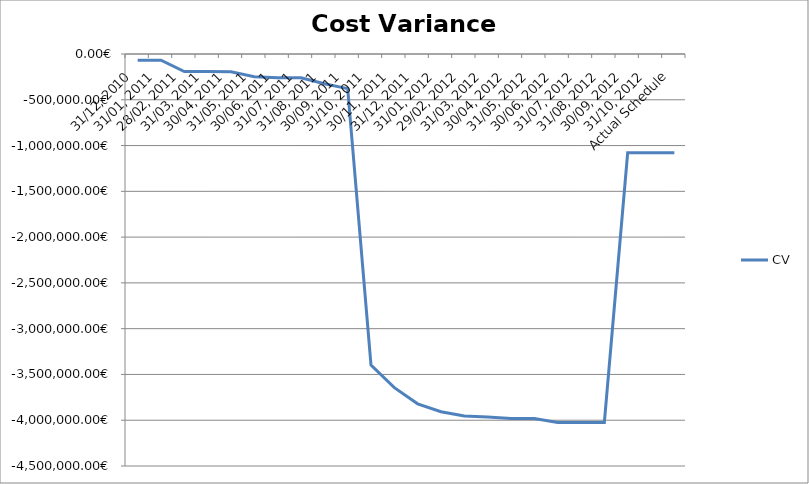
| Category | CV |
|---|---|
| 31/12, 2010 | -67983.03 |
| 31/01, 2011 | -67983.03 |
| 28/02, 2011 | -192248.889 |
| 31/03, 2011 | -192248.889 |
| 30/04, 2011 | -195073.429 |
| 31/05, 2011 | -247301.82 |
| 30/06, 2011 | -259171.91 |
| 31/07, 2011 | -259171.91 |
| 31/08, 2011 | -324457.33 |
| 30/09, 2011 | -378517.689 |
| 31/10, 2011 | -3396880.659 |
| 30/11, 2011 | -3644709.773 |
| 31/12, 2011 | -3821030.91 |
| 31/01, 2012 | -3907450.38 |
| 29/02, 2012 | -3954930.72 |
| 31/03, 2012 | -3964418.5 |
| 30/04, 2012 | -3981669.01 |
| 31/05, 2012 | -3981669.01 |
| 30/06, 2012 | -4023938.2 |
| 31/07, 2012 | -4023938.2 |
| 31/08, 2012 | -4023938.2 |
| 30/09, 2012 | -1079820.57 |
| 31/10, 2012 | -1079820.57 |
| Actual Schedule | -1079820.57 |